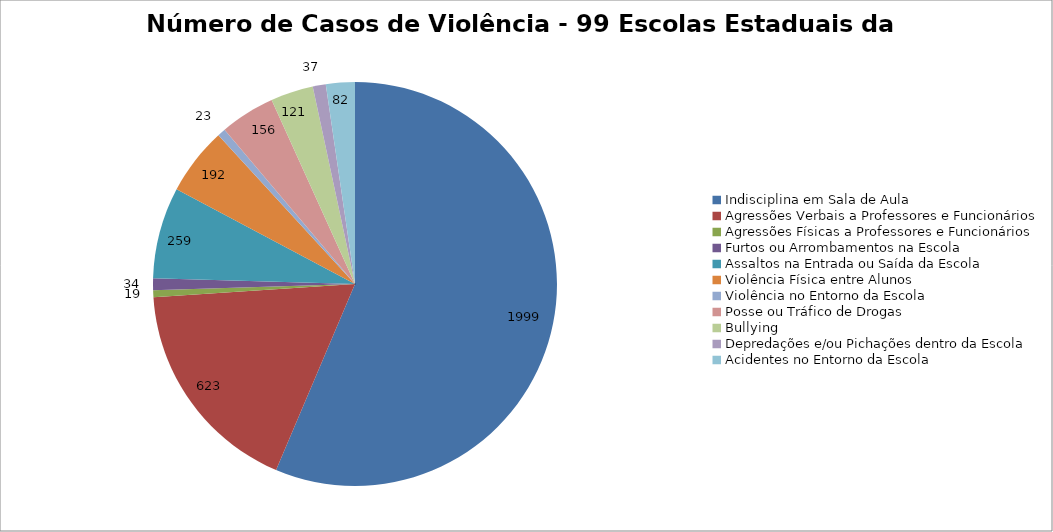
| Category | Número de Casos |
|---|---|
| Indisciplina em Sala de Aula | 1999 |
| Agressões Verbais a Professores e Funcionários | 623 |
| Agressões Físicas a Professores e Funcionários | 19 |
| Furtos ou Arrombamentos na Escola | 34 |
| Assaltos na Entrada ou Saída da Escola | 259 |
| Violência Física entre Alunos | 192 |
| Violência no Entorno da Escola | 23 |
| Posse ou Tráfico de Drogas | 156 |
| Bullying | 121 |
| Depredações e/ou Pichações dentro da Escola | 37 |
| Acidentes no Entorno da Escola | 82 |